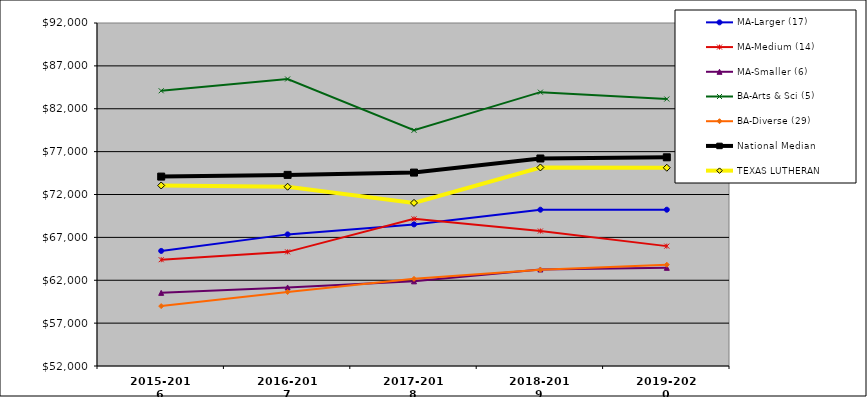
| Category | MA-Larger (17) | MA-Medium (14) | MA-Smaller (6) | BA-Arts & Sci (5) | BA-Diverse (29) | National Median | TEXAS LUTHERAN |
|---|---|---|---|---|---|---|---|
| 2015-2016 | 65421 | 64395 | 60529.5 | 84096 | 58986 | 74088 | 73053 |
| 2016-2017 | 67349 | 65311.5 | 61159.5 | 85470 | 60628 | 74288 | 72909 |
| 2017-2018 | 68515 | 69157.5 | 61873.5 | 79487 | 62162 | 74555 | 71021 |
| 2018-2019 | 70227 | 67740 | 63254.5 | 83935 | 63223 | 76199 | 75154 |
| 2019-2020 | 70227 | 65980 | 63449.5 | 83137 | 63812 | 76337 | 75120 |